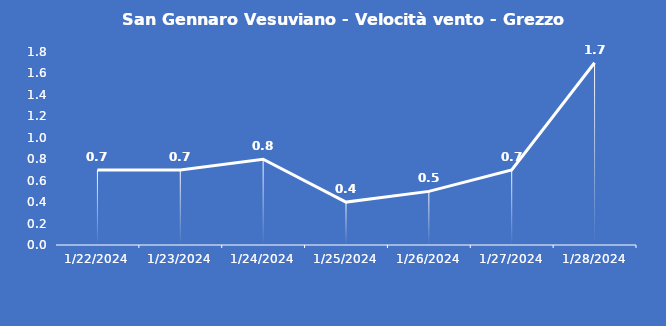
| Category | San Gennaro Vesuviano - Velocità vento - Grezzo (m/s) |
|---|---|
| 1/22/24 | 0.7 |
| 1/23/24 | 0.7 |
| 1/24/24 | 0.8 |
| 1/25/24 | 0.4 |
| 1/26/24 | 0.5 |
| 1/27/24 | 0.7 |
| 1/28/24 | 1.7 |